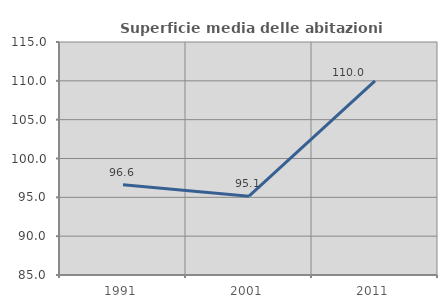
| Category | Superficie media delle abitazioni occupate |
|---|---|
| 1991.0 | 96.605 |
| 2001.0 | 95.149 |
| 2011.0 | 109.982 |